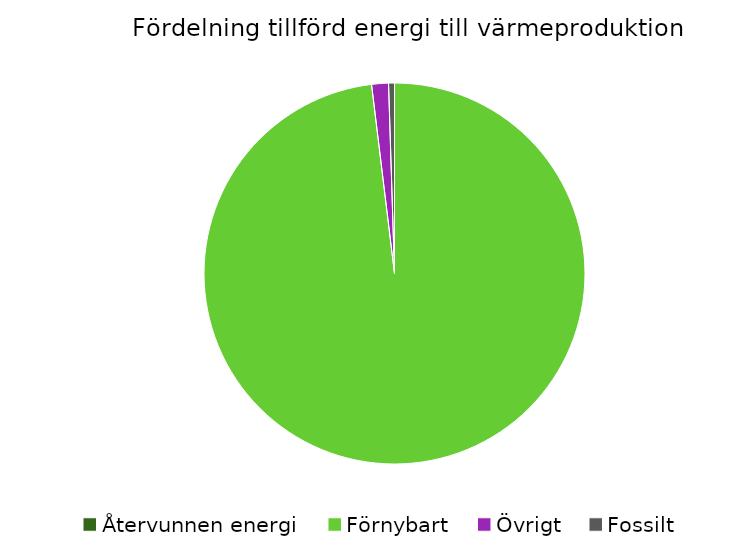
| Category | Fördelning värmeproduktion |
|---|---|
| Återvunnen energi | 0 |
| Förnybart | 0.981 |
| Övrigt | 0.014 |
| Fossilt | 0.005 |